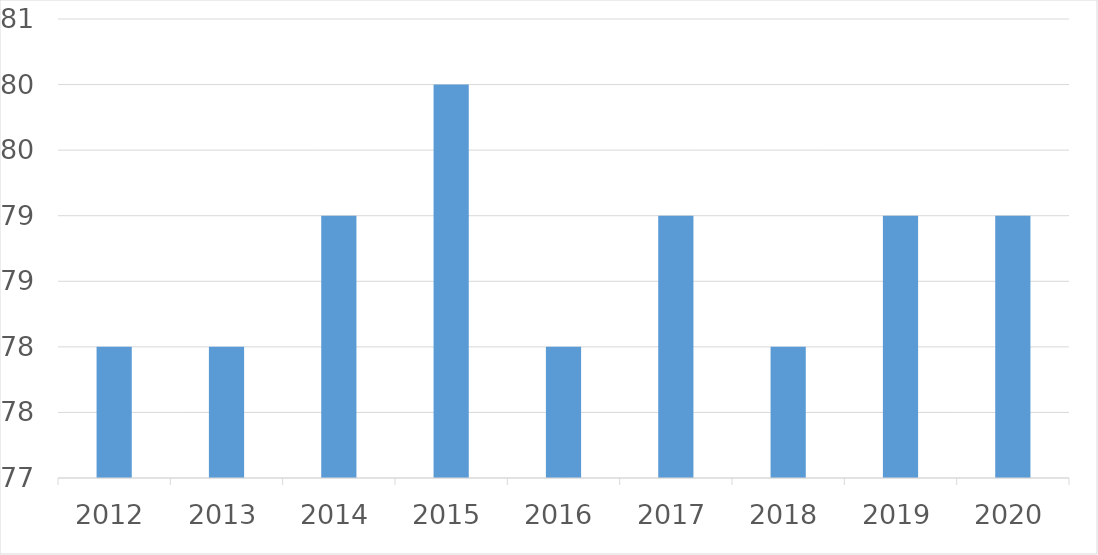
| Category | Series 0 |
|---|---|
| 2012 | 78 |
| 2013 | 78 |
| 2014 | 79 |
| 2015 | 80 |
| 2016 | 78 |
| 2017 | 79 |
| 2018 | 78 |
| 2019 | 79 |
| 2020 | 79 |